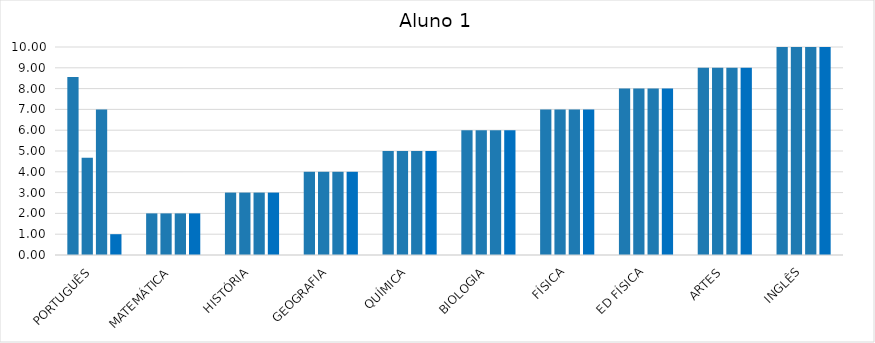
| Category | 1o Trimestre | 2o Trimestre | 3o Trimestre | 4o Trimestre |
|---|---|---|---|---|
| PORTUGUÊS | 8.56 | 4.67 | 7 | 1 |
| MATEMÁTICA | 2 | 2 | 2 | 2 |
| HISTÓRIA | 3 | 3 | 3 | 3 |
| GEOGRAFIA | 4 | 4 | 4 | 4 |
| QUÍMICA | 5 | 5 | 5 | 5 |
| BIOLOGIA | 6 | 6 | 6 | 6 |
| FÍSICA | 7 | 7 | 7 | 7 |
| ED FÍSICA | 8 | 8 | 8 | 8 |
| ARTES | 9 | 9 | 9 | 9 |
| INGLÊS | 10 | 10 | 10 | 10 |